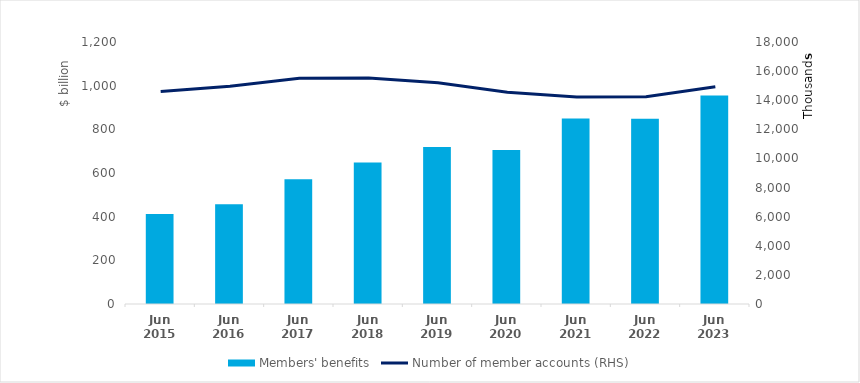
| Category | Members' benefits |
|---|---|
| Jun 2015 | 412 |
| Jun 2016 | 457 |
| Jun 2017 | 571 |
| Jun 2018 | 648 |
| Jun 2019 | 719 |
| Jun 2020 | 705 |
| Jun 2021 | 850 |
| Jun 2022 | 848 |
| Jun 2023 | 955 |